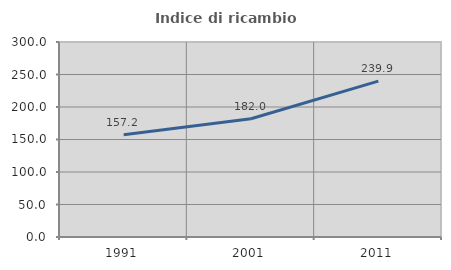
| Category | Indice di ricambio occupazionale  |
|---|---|
| 1991.0 | 157.246 |
| 2001.0 | 181.955 |
| 2011.0 | 239.869 |